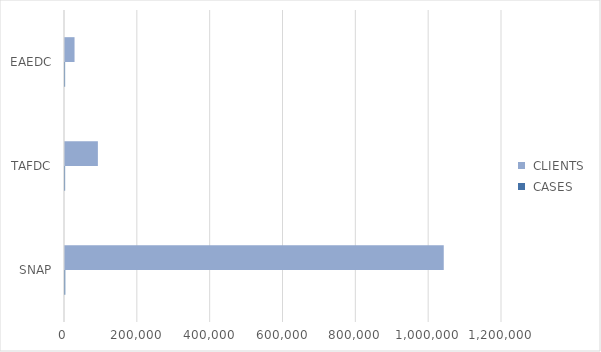
| Category |  CASES |  CLIENTS |
|---|---|---|
| SNAP | 773 | 1040065 |
| TAFDC | 341 | 90289 |
| EAEDC | 318 | 26197 |